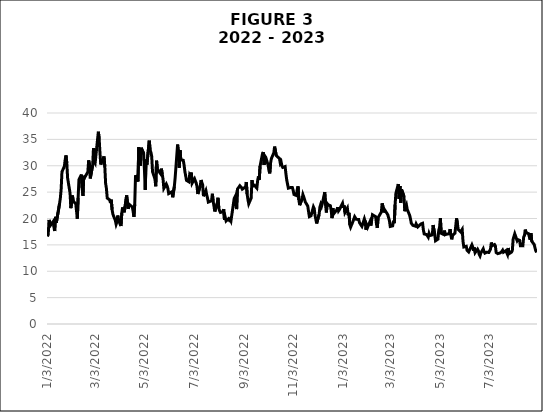
| Category | Series 0 |
|---|---|
| 1/3/22 | 16.6 |
| 1/4/22 | 16.91 |
| 1/5/22 | 19.73 |
| 1/6/22 | 19.61 |
| 1/7/22 | 18.76 |
| 1/10/22 | 19.4 |
| 1/11/22 | 18.41 |
| 1/12/22 | 17.62 |
| 1/13/22 | 20.31 |
| 1/14/22 | 19.19 |
| 1/18/22 | 22.79 |
| 1/19/22 | 23.85 |
| 1/20/22 | 25.59 |
| 1/21/22 | 28.85 |
| 1/24/22 | 29.9 |
| 1/25/22 | 31.16 |
| 1/26/22 | 31.96 |
| 1/27/22 | 30.49 |
| 1/28/22 | 27.66 |
| 1/31/22 | 24.83 |
| 2/1/22 | 21.96 |
| 2/2/22 | 22.09 |
| 2/3/22 | 24.35 |
| 2/4/22 | 23.22 |
| 2/7/22 | 22.86 |
| 2/8/22 | 21.44 |
| 2/9/22 | 19.96 |
| 2/10/22 | 23.91 |
| 2/11/22 | 27.36 |
| 2/14/22 | 28.33 |
| 2/15/22 | 25.7 |
| 2/16/22 | 24.29 |
| 2/17/22 | 28.11 |
| 2/18/22 | 27.75 |
| 2/22/22 | 28.81 |
| 2/23/22 | 31.02 |
| 2/24/22 | 30.32 |
| 2/25/22 | 27.59 |
| 2/28/22 | 30.15 |
| 3/1/22 | 33.32 |
| 3/2/22 | 30.74 |
| 3/3/22 | 30.48 |
| 3/4/22 | 31.98 |
| 3/7/22 | 36.45 |
| 3/8/22 | 35.13 |
| 3/9/22 | 32.45 |
| 3/10/22 | 30.23 |
| 3/11/22 | 30.75 |
| 3/14/22 | 31.77 |
| 3/15/22 | 29.83 |
| 3/16/22 | 26.67 |
| 3/17/22 | 25.67 |
| 3/18/22 | 23.87 |
| 3/21/22 | 23.53 |
| 3/22/22 | 22.94 |
| 3/23/22 | 23.57 |
| 3/24/22 | 21.67 |
| 3/25/22 | 20.81 |
| 3/28/22 | 19.63 |
| 3/29/22 | 18.9 |
| 3/30/22 | 19.33 |
| 3/31/22 | 20.56 |
| 4/1/22 | 19.63 |
| 4/4/22 | 18.57 |
| 4/5/22 | 21.03 |
| 4/6/22 | 22.1 |
| 4/7/22 | 21.55 |
| 4/8/22 | 21.16 |
| 4/11/22 | 24.37 |
| 4/12/22 | 24.26 |
| 4/13/22 | 21.82 |
| 4/14/22 | 22.7 |
| 4/18/22 | 22.17 |
| 4/19/22 | 21.37 |
| 4/20/22 | 20.32 |
| 4/21/22 | 22.68 |
| 4/22/22 | 28.21 |
| 4/25/22 | 27.02 |
| 4/26/22 | 33.52 |
| 4/27/22 | 31.6 |
| 4/28/22 | 29.99 |
| 4/29/22 | 33.4 |
| 5/2/22 | 32.34 |
| 5/3/22 | 29.25 |
| 5/4/22 | 25.42 |
| 5/5/22 | 31.2 |
| 5/6/22 | 30.19 |
| 5/9/22 | 34.75 |
| 5/10/22 | 32.99 |
| 5/11/22 | 32.56 |
| 5/12/22 | 31.77 |
| 5/13/22 | 28.87 |
| 5/16/22 | 27.47 |
| 5/17/22 | 26.1 |
| 5/18/22 | 30.96 |
| 5/19/22 | 29.35 |
| 5/20/22 | 29.43 |
| 5/23/22 | 28.48 |
| 5/24/22 | 29.45 |
| 5/25/22 | 28.37 |
| 5/26/22 | 27.5 |
| 5/27/22 | 25.72 |
| 5/30/22 | 26.54 |
| 5/31/22 | 26.19 |
| 6/1/22 | 25.69 |
| 6/2/22 | 24.72 |
| 6/3/22 | 24.79 |
| 6/6/22 | 25.07 |
| 6/7/22 | 24.02 |
| 6/8/22 | 23.96 |
| 6/9/22 | 26.09 |
| 6/10/22 | 27.75 |
| 6/13/22 | 34.02 |
| 6/14/22 | 32.69 |
| 6/15/22 | 29.62 |
| 6/16/22 | 32.95 |
| 6/17/22 | 31.13 |
| 6/20/22 | 31.03 |
| 6/21/22 | 30.19 |
| 6/22/22 | 28.95 |
| 6/23/22 | 29.05 |
| 6/24/22 | 27.23 |
| 6/27/22 | 26.95 |
| 6/28/22 | 28.36 |
| 6/29/22 | 28.16 |
| 6/30/22 | 28.71 |
| 7/1/22 | 26.7 |
| 7/4/22 | 27.53 |
| 7/5/22 | 27.54 |
| 7/6/22 | 26.73 |
| 7/7/22 | 26.08 |
| 7/8/22 | 24.64 |
| 7/11/22 | 26.17 |
| 7/12/22 | 27.29 |
| 7/13/22 | 26.82 |
| 7/14/22 | 26.4 |
| 7/15/22 | 24.23 |
| 7/18/22 | 25.3 |
| 7/19/22 | 24.5 |
| 7/20/22 | 23.88 |
| 7/21/22 | 23.11 |
| 7/22/22 | 23.03 |
| 7/25/22 | 23.36 |
| 7/26/22 | 24.69 |
| 7/27/22 | 23.24 |
| 7/28/22 | 22.33 |
| 7/29/22 | 21.33 |
| 8/1/22 | 22.84 |
| 8/2/22 | 23.93 |
| 8/3/22 | 21.95 |
| 8/4/22 | 21.44 |
| 8/5/22 | 21.15 |
| 8/8/22 | 21.29 |
| 8/9/22 | 21.77 |
| 8/10/22 | 19.74 |
| 8/11/22 | 20.2 |
| 8/12/22 | 19.53 |
| 8/15/22 | 19.95 |
| 8/16/22 | 19.69 |
| 8/17/22 | 19.9 |
| 8/18/22 | 19.56 |
| 8/19/22 | 20.6 |
| 8/22/22 | 23.8 |
| 8/23/22 | 24.11 |
| 8/24/22 | 22.82 |
| 8/25/22 | 21.78 |
| 8/26/22 | 25.56 |
| 8/29/22 | 26.21 |
| 8/30/22 | 26.21 |
| 8/31/22 | 25.87 |
| 9/1/22 | 25.56 |
| 9/2/22 | 25.47 |
| 9/5/22 | 25.99 |
| 9/6/22 | 26.91 |
| 9/7/22 | 24.64 |
| 9/8/22 | 23.61 |
| 9/9/22 | 22.79 |
| 9/12/22 | 23.87 |
| 9/13/22 | 27.27 |
| 9/14/22 | 26.16 |
| 9/15/22 | 26.27 |
| 9/16/22 | 26.3 |
| 9/19/22 | 25.76 |
| 9/20/22 | 27.16 |
| 9/21/22 | 27.99 |
| 9/22/22 | 27.35 |
| 9/23/22 | 29.92 |
| 9/26/22 | 32.26 |
| 9/27/22 | 32.6 |
| 9/28/22 | 30.18 |
| 9/29/22 | 31.84 |
| 9/30/22 | 31.62 |
| 10/3/22 | 30.1 |
| 10/4/22 | 29.07 |
| 10/5/22 | 28.55 |
| 10/6/22 | 30.52 |
| 10/7/22 | 31.36 |
| 10/10/22 | 32.45 |
| 10/11/22 | 33.63 |
| 10/12/22 | 33.57 |
| 10/13/22 | 31.94 |
| 10/14/22 | 32.02 |
| 10/17/22 | 31.37 |
| 10/18/22 | 30.5 |
| 10/19/22 | 30.76 |
| 10/20/22 | 29.98 |
| 10/21/22 | 29.69 |
| 10/24/22 | 29.85 |
| 10/25/22 | 28.46 |
| 10/26/22 | 27.28 |
| 10/27/22 | 27.39 |
| 10/28/22 | 25.75 |
| 10/31/22 | 25.88 |
| 11/1/22 | 25.81 |
| 11/2/22 | 25.86 |
| 11/3/22 | 25.3 |
| 11/4/22 | 24.55 |
| 11/7/22 | 24.35 |
| 11/8/22 | 25.54 |
| 11/9/22 | 26.09 |
| 11/10/22 | 23.53 |
| 11/11/22 | 22.52 |
| 11/14/22 | 23.73 |
| 11/15/22 | 24.54 |
| 11/16/22 | 24.11 |
| 11/17/22 | 23.93 |
| 11/18/22 | 23.12 |
| 11/21/22 | 22.36 |
| 11/22/22 | 21.29 |
| 11/23/22 | 20.35 |
| 11/24/22 | 20.42 |
| 11/25/22 | 20.5 |
| 11/28/22 | 22.21 |
| 11/29/22 | 21.89 |
| 11/30/22 | 20.58 |
| 12/1/22 | 19.84 |
| 12/2/22 | 19.06 |
| 12/5/22 | 20.75 |
| 12/6/22 | 22.17 |
| 12/7/22 | 22.68 |
| 12/8/22 | 22.29 |
| 12/9/22 | 22.83 |
| 12/12/22 | 25 |
| 12/13/22 | 22.55 |
| 12/14/22 | 21.14 |
| 12/15/22 | 22.83 |
| 12/16/22 | 22.62 |
| 12/19/22 | 22.42 |
| 12/20/22 | 21.48 |
| 12/21/22 | 20.07 |
| 12/22/22 | 21.97 |
| 12/23/22 | 20.87 |
| 12/27/22 | 21.65 |
| 12/28/22 | 22.14 |
| 12/29/22 | 21.44 |
| 12/30/22 | 21.67 |
| 1/3/23 | 22.9 |
| 1/4/23 | 22.01 |
| 1/5/23 | 22.46 |
| 1/6/23 | 21.13 |
| 1/9/23 | 21.97 |
| 1/10/23 | 20.58 |
| 1/11/23 | 21.09 |
| 1/12/23 | 18.83 |
| 1/13/23 | 18.35 |
| 1/16/23 | 19.49 |
| 1/17/23 | 19.36 |
| 1/18/23 | 20.34 |
| 1/19/23 | 20.52 |
| 1/20/23 | 19.85 |
| 1/23/23 | 19.81 |
| 1/24/23 | 19.2 |
| 1/25/23 | 19.08 |
| 1/26/23 | 18.73 |
| 1/27/23 | 18.51 |
| 1/30/23 | 19.94 |
| 1/31/23 | 19.4 |
| 2/1/23 | 17.87 |
| 2/2/23 | 18.73 |
| 2/3/23 | 18.33 |
| 2/6/23 | 19.43 |
| 2/7/23 | 18.66 |
| 2/8/23 | 19.63 |
| 2/9/23 | 20.71 |
| 2/10/23 | 20.53 |
| 2/13/23 | 20.34 |
| 2/14/23 | 18.91 |
| 2/15/23 | 18.23 |
| 2/16/23 | 20.17 |
| 2/17/23 | 20.02 |
| 2/20/23 | 21.23 |
| 2/21/23 | 22.87 |
| 2/22/23 | 22.29 |
| 2/23/23 | 21.14 |
| 2/24/23 | 21.67 |
| 2/27/23 | 20.95 |
| 2/28/23 | 20.7 |
| 3/1/23 | 20.58 |
| 3/2/23 | 19.59 |
| 3/3/23 | 18.49 |
| 3/6/23 | 18.61 |
| 3/7/23 | 19.59 |
| 3/8/23 | 19.11 |
| 3/9/23 | 22.61 |
| 3/10/23 | 24.8 |
| 3/13/23 | 26.52 |
| 3/14/23 | 23.73 |
| 3/15/23 | 26.14 |
| 3/16/23 | 22.99 |
| 3/17/23 | 25.51 |
| 3/20/23 | 24.15 |
| 3/21/23 | 21.38 |
| 3/22/23 | 22.26 |
| 3/23/23 | 22.61 |
| 3/24/23 | 21.74 |
| 3/27/23 | 20.6 |
| 3/28/23 | 19.97 |
| 3/29/23 | 19.12 |
| 3/30/23 | 19.02 |
| 3/31/23 | 18.7 |
| 4/3/23 | 18.55 |
| 4/4/23 | 19 |
| 4/5/23 | 19.08 |
| 4/6/23 | 18.4 |
| 4/10/23 | 18.97 |
| 4/11/23 | 19.1 |
| 4/12/23 | 19.09 |
| 4/13/23 | 17.8 |
| 4/14/23 | 17.07 |
| 4/17/23 | 16.95 |
| 4/18/23 | 16.83 |
| 4/19/23 | 16.46 |
| 4/20/23 | 17.17 |
| 4/21/23 | 16.77 |
| 4/24/23 | 16.89 |
| 4/25/23 | 18.76 |
| 4/26/23 | 18.84 |
| 4/27/23 | 17.03 |
| 4/28/23 | 15.78 |
| 5/1/23 | 16.08 |
| 5/2/23 | 17.78 |
| 5/3/23 | 18.34 |
| 5/4/23 | 20.09 |
| 5/5/23 | 17.19 |
| 5/8/23 | 16.98 |
| 5/9/23 | 17.71 |
| 5/10/23 | 16.94 |
| 5/11/23 | 16.93 |
| 5/12/23 | 17.03 |
| 5/15/23 | 17.12 |
| 5/16/23 | 17.99 |
| 5/17/23 | 16.87 |
| 5/18/23 | 16.05 |
| 5/19/23 | 16.81 |
| 5/22/23 | 17.21 |
| 5/23/23 | 18.53 |
| 5/24/23 | 20.03 |
| 5/25/23 | 19.14 |
| 5/26/23 | 17.95 |
| 5/29/23 | 17.46 |
| 5/30/23 | 17.46 |
| 5/31/23 | 17.94 |
| 6/1/23 | 15.65 |
| 6/2/23 | 14.6 |
| 6/5/23 | 14.73 |
| 6/6/23 | 13.96 |
| 6/7/23 | 13.94 |
| 6/8/23 | 13.65 |
| 6/9/23 | 13.83 |
| 6/12/23 | 15.01 |
| 6/13/23 | 14.61 |
| 6/14/23 | 13.88 |
| 6/15/23 | 14.5 |
| 6/16/23 | 13.54 |
| 6/19/23 | 14.19 |
| 6/20/23 | 13.88 |
| 6/21/23 | 13.2 |
| 6/22/23 | 12.91 |
| 6/23/23 | 13.44 |
| 6/26/23 | 14.25 |
| 6/27/23 | 13.74 |
| 6/28/23 | 13.43 |
| 6/29/23 | 13.54 |
| 6/30/23 | 13.59 |
| 7/3/23 | 13.57 |
| 7/4/23 | 13.7 |
| 7/5/23 | 14.18 |
| 7/6/23 | 15.44 |
| 7/7/23 | 14.83 |
| 7/10/23 | 15.07 |
| 7/11/23 | 14.84 |
| 7/12/23 | 13.54 |
| 7/13/23 | 13.61 |
| 7/14/23 | 13.34 |
| 7/17/23 | 13.48 |
| 7/18/23 | 13.3 |
| 7/19/23 | 13.76 |
| 7/20/23 | 13.99 |
| 7/21/23 | 13.6 |
| 7/24/23 | 13.91 |
| 7/25/23 | 13.86 |
| 7/26/23 | 13.19 |
| 7/27/23 | 14.41 |
| 7/28/23 | 13.33 |
| 7/31/23 | 13.63 |
| 8/1/23 | 13.93 |
| 8/2/23 | 16.09 |
| 8/3/23 | 15.92 |
| 8/4/23 | 17.1 |
| 8/7/23 | 15.77 |
| 8/8/23 | 15.99 |
| 8/9/23 | 15.96 |
| 8/10/23 | 15.85 |
| 8/11/23 | 14.84 |
| 8/14/23 | 14.82 |
| 8/15/23 | 16.46 |
| 8/16/23 | 16.78 |
| 8/17/23 | 17.89 |
| 8/18/23 | 17.3 |
| 8/21/23 | 17.13 |
| 8/22/23 | 16.97 |
| 8/23/23 | 15.98 |
| 8/24/23 | 17.2 |
| 8/25/23 | 15.68 |
| 8/28/23 | 15.08 |
| 8/29/23 | 14.45 |
| 8/30/23 | 13.88 |
| 8/31/23 | 13.57 |